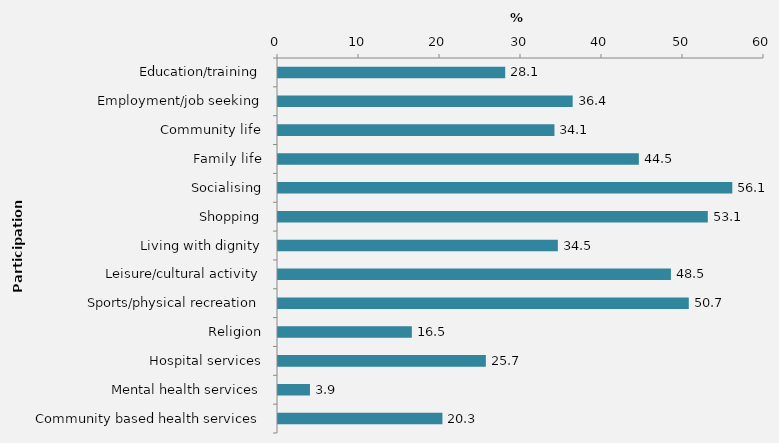
| Category | Participation restriction |
|---|---|
| Education/training | 28.051 |
| Employment/job seeking | 36.378 |
| Community life | 34.131 |
| Family life | 44.547 |
| Socialising | 56.087 |
| Shopping | 53.062 |
| Living with dignity | 34.548 |
| Leisure/cultural activity | 48.509 |
| Sports/physical recreation | 50.713 |
| Religion | 16.525 |
| Hospital services | 25.659 |
| Mental health services | 3.948 |
| Community based health services | 20.3 |